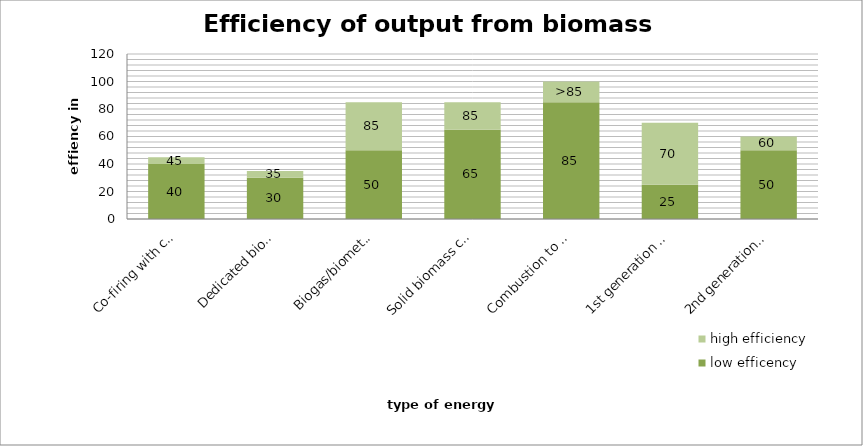
| Category | low efficency | high efficiency |
|---|---|---|
| 0 | 40 | 5 |
| 1 | 30 | 5 |
| 2 | 50 | 35 |
| 3 | 65 | 20 |
| 4 | 85 | 15 |
| 5 | 25 | 45 |
| 6 | 50 | 10 |